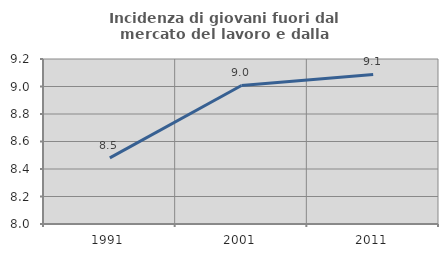
| Category | Incidenza di giovani fuori dal mercato del lavoro e dalla formazione  |
|---|---|
| 1991.0 | 8.481 |
| 2001.0 | 9.007 |
| 2011.0 | 9.088 |